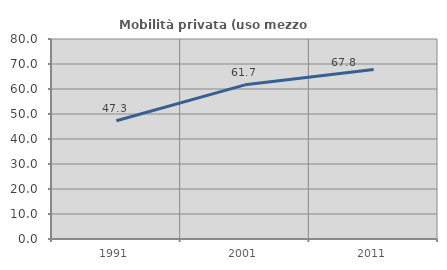
| Category | Mobilità privata (uso mezzo privato) |
|---|---|
| 1991.0 | 47.321 |
| 2001.0 | 61.667 |
| 2011.0 | 67.836 |